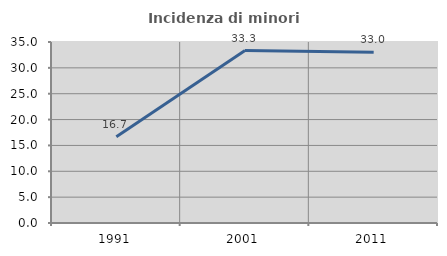
| Category | Incidenza di minori stranieri |
|---|---|
| 1991.0 | 16.667 |
| 2001.0 | 33.333 |
| 2011.0 | 33.023 |